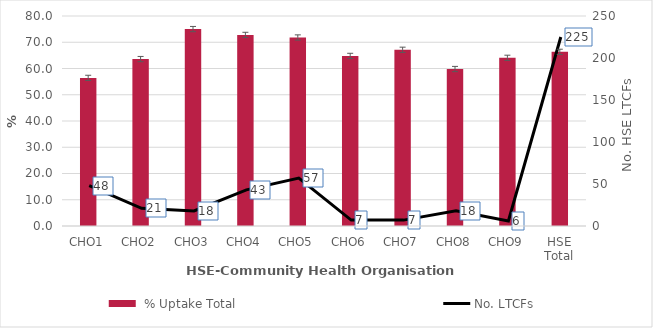
| Category |  % Uptake Total |
|---|---|
| CHO1 | 56.423 |
| CHO2 | 63.59 |
| CHO3 | 75.02 |
| CHO4 | 72.794 |
| CHO5 | 71.811 |
| CHO6 | 64.795 |
| CHO7 | 67.125 |
| CHO8 | 59.798 |
| CHO9 | 64.067 |
| HSE Total | 66.35 |